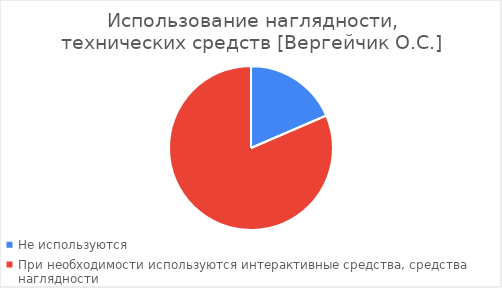
| Category | Series 0 |
|---|---|
| Не используются | 15 |
| При необходимости используются интерактивные средства, средства наглядности | 66 |